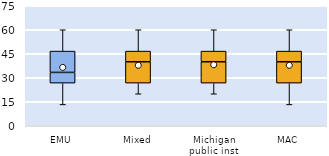
| Category | 25th | 50th | 75th |
|---|---|---|---|
| EMU | 26.667 | 6.667 | 13.333 |
| Mixed | 26.667 | 13.333 | 6.667 |
| Michigan public inst | 26.667 | 13.333 | 6.667 |
| MAC | 26.667 | 13.333 | 6.667 |